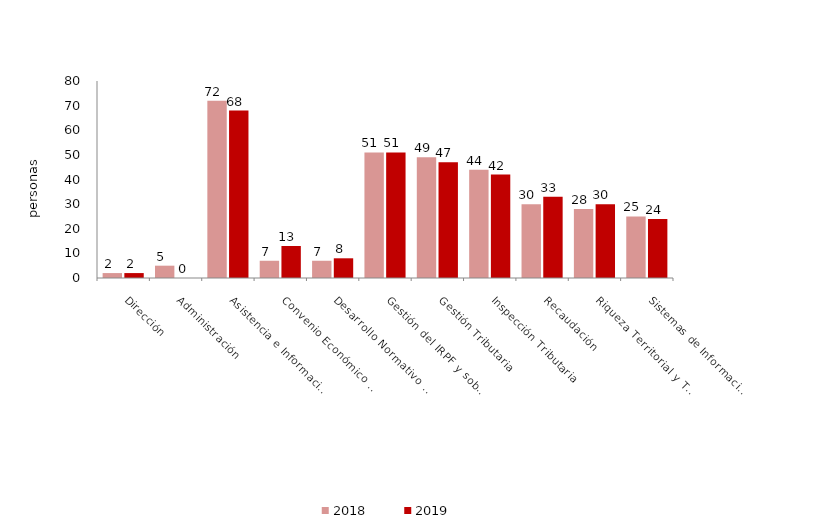
| Category | 2018 | 2019 |
|---|---|---|
| Dirección | 2 | 2 |
| Administración | 5 | 0 |
| Asistencia e Información al Contribuyente | 72 | 68 |
| Convenio Económico y Planificación Financiera | 7 | 13 |
| Desarrollo Normativo y Asesoramiento Jurídico | 7 | 8 |
| Gestión del IRPF y sobre el Patrimonio | 51 | 51 |
| Gestión Tributaria | 49 | 47 |
| Inspección Tributaria | 44 | 42 |
| Recaudación | 30 | 33 |
| Riqueza Territorial y Tributos Patrimoniales | 28 | 30 |
| Sistemas de Información Tributaria | 25 | 24 |